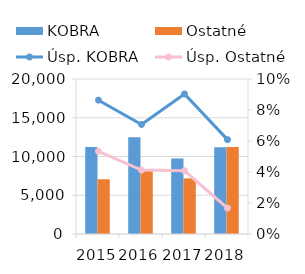
| Category | KOBRA | Ostatné |
|---|---|---|
| 2015.0 | 11236 | 7062 |
| 2016.0 | 12493 | 8364 |
| 2017.0 | 9754 | 7181 |
| 2018.0 | 11185 | 11238 |